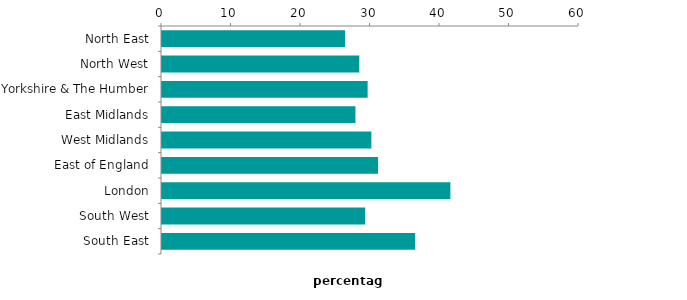
| Category | Series 0 |
|---|---|
| North East | 26.336 |
| North West | 28.386 |
| Yorkshire & The Humber | 29.587 |
| East Midlands | 27.833 |
| West Midlands | 30.124 |
| East of England | 31.088 |
| London | 41.493 |
| South West | 29.236 |
| South East | 36.428 |